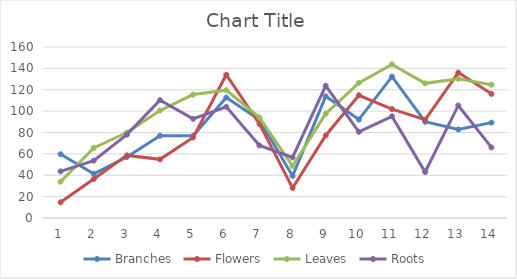
| Category | Branches  | Flowers  | Leaves  | Roots  |
|---|---|---|---|---|
| 0 | 59.661 | 14.69 | 33.976 | 43.619 |
| 1 | 41.366 | 36.41 | 65.609 | 53.623 |
| 2 | 57.048 | 58.58 | 79.984 | 78.001 |
| 3 | 76.92 | 54.885 | 100.532 | 110.265 |
| 4 | 76.92 | 75.297 | 115.492 | 92.736 |
| 5 | 112.698 | 134.012 | 119.593 | 104.001 |
| 6 | 91.925 | 88.095 | 93.998 | 67.862 |
| 7 | 39.339 | 28.118 | 48.576 | 56.642 |
| 8 | 113.825 | 77.235 | 97.558 | 123.693 |
| 9 | 92.105 | 114.861 | 126.397 | 80.615 |
| 10 | 132.21 | 101.929 | 143.745 | 95.079 |
| 11 | 90.123 | 91.925 | 125.991 | 43.034 |
| 12 | 82.823 | 136.04 | 130.227 | 105.308 |
| 13 | 89.266 | 116.168 | 124.73 | 66.06 |